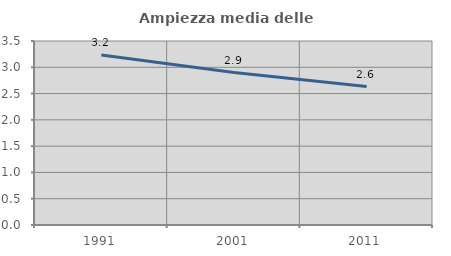
| Category | Ampiezza media delle famiglie |
|---|---|
| 1991.0 | 3.236 |
| 2001.0 | 2.9 |
| 2011.0 | 2.634 |